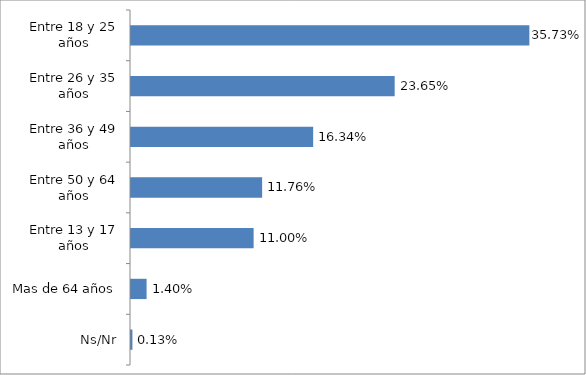
| Category | Series 0 |
|---|---|
| Ns/Nr | 0.001 |
| Mas de 64 años | 0.014 |
| Entre 13 y 17 años | 0.11 |
| Entre 50 y 64 años | 0.118 |
| Entre 36 y 49 años | 0.163 |
| Entre 26 y 35 años | 0.236 |
| Entre 18 y 25 años | 0.357 |